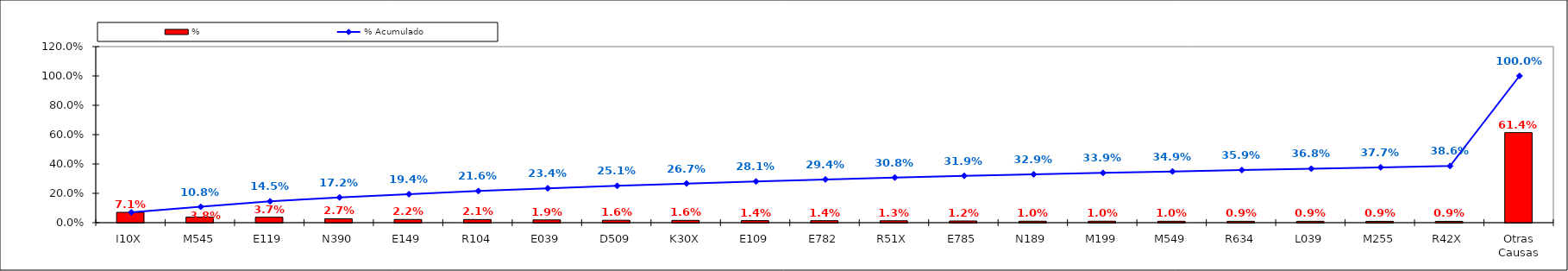
| Category | % |
|---|---|
| I10X | 0.071 |
| M545 | 0.038 |
| E119 | 0.037 |
| N390 | 0.027 |
| E149 | 0.022 |
| R104 | 0.021 |
| E039 | 0.019 |
| D509 | 0.016 |
| K30X | 0.016 |
| E109 | 0.014 |
| E782 | 0.014 |
| R51X | 0.013 |
| E785 | 0.012 |
| N189 | 0.01 |
| M199 | 0.01 |
| M549 | 0.01 |
| R634 | 0.009 |
| L039 | 0.009 |
| M255 | 0.009 |
| R42X | 0.009 |
| Otras Causas | 0.614 |